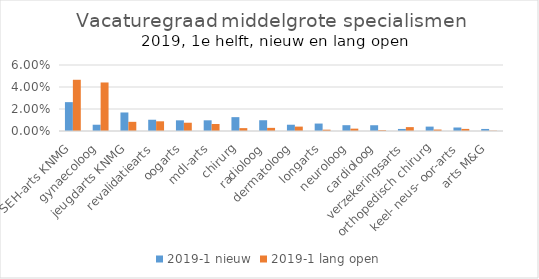
| Category | 2019-1 |
|---|---|
| SEH-arts KNMG | 0.047 |
| gynaecoloog | 0.044 |
| jeugdarts KNMG | 0.008 |
| revalidatiearts | 0.009 |
| oogarts | 0.008 |
| mdl-arts | 0.006 |
| chirurg | 0.003 |
| radioloog | 0.003 |
| dermatoloog | 0.004 |
| longarts | 0.001 |
| neuroloog | 0.002 |
| cardioloog | 0.001 |
| verzekeringsarts | 0.004 |
| orthopedisch chirurg | 0.001 |
| keel- neus- oor-arts | 0.002 |
| arts M&G | 0 |